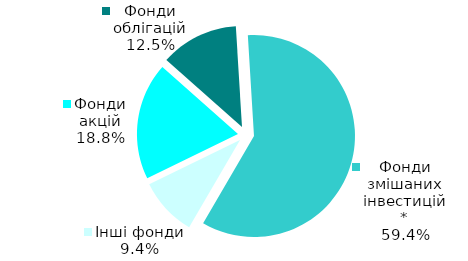
| Category | Series 0 |
|---|---|
| Фонди акцій | 6 |
| Фонди облігацій | 4 |
| Фонди змішаних інвестицій* | 19 |
| Інші фонди | 3 |